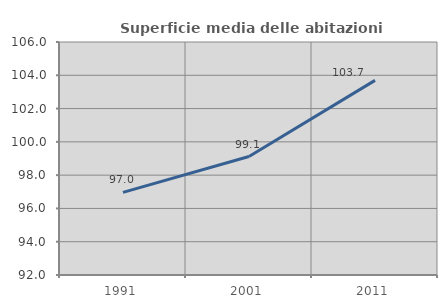
| Category | Superficie media delle abitazioni occupate |
|---|---|
| 1991.0 | 96.966 |
| 2001.0 | 99.118 |
| 2011.0 | 103.694 |